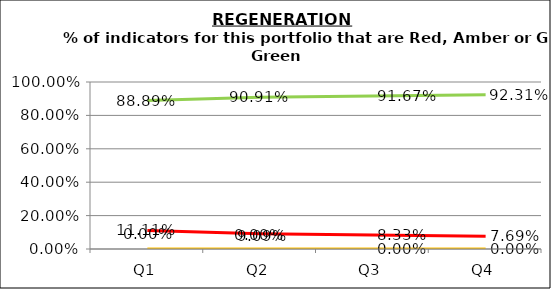
| Category | Green | Amber | Red |
|---|---|---|---|
| Q1 | 0.889 | 0 | 0.111 |
| Q2 | 0.909 | 0 | 0.091 |
| Q3 | 0.917 | 0 | 0.083 |
| Q4 | 0.923 | 0 | 0.077 |